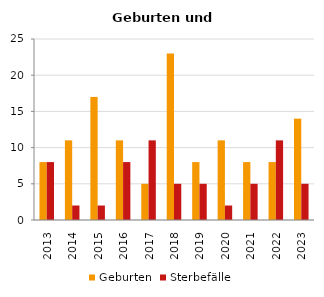
| Category | Geburten | Sterbefälle |
|---|---|---|
| 2013.0 | 8 | 8 |
| 2014.0 | 11 | 2 |
| 2015.0 | 17 | 2 |
| 2016.0 | 11 | 8 |
| 2017.0 | 5 | 11 |
| 2018.0 | 23 | 5 |
| 2019.0 | 8 | 5 |
| 2020.0 | 11 | 2 |
| 2021.0 | 8 | 5 |
| 2022.0 | 8 | 11 |
| 2023.0 | 14 | 5 |